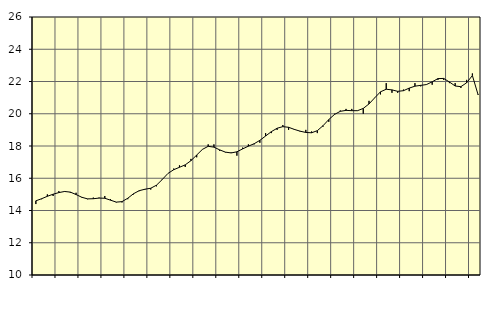
| Category | Piggar | Finansiell verksamhet, företagstjänster, SNI 64-82 |
|---|---|---|
| nan | 14.4 | 14.6 |
| 1.0 | 14.7 | 14.73 |
| 1.0 | 15 | 14.88 |
| 1.0 | 14.9 | 15.01 |
| nan | 15.2 | 15.11 |
| 2.0 | 15.2 | 15.18 |
| 2.0 | 15.1 | 15.14 |
| 2.0 | 15.1 | 14.99 |
| nan | 14.8 | 14.82 |
| 3.0 | 14.7 | 14.72 |
| 3.0 | 14.8 | 14.73 |
| 3.0 | 14.8 | 14.77 |
| nan | 14.9 | 14.76 |
| 4.0 | 14.7 | 14.64 |
| 4.0 | 14.5 | 14.52 |
| 4.0 | 14.5 | 14.55 |
| nan | 14.7 | 14.76 |
| 5.0 | 15 | 15.04 |
| 5.0 | 15.2 | 15.23 |
| 5.0 | 15.3 | 15.32 |
| nan | 15.3 | 15.38 |
| 6.0 | 15.5 | 15.57 |
| 6.0 | 15.9 | 15.92 |
| 6.0 | 16.3 | 16.3 |
| nan | 16.6 | 16.53 |
| 7.0 | 16.8 | 16.68 |
| 7.0 | 16.7 | 16.83 |
| 7.0 | 17.2 | 17.09 |
| nan | 17.3 | 17.44 |
| 8.0 | 17.8 | 17.79 |
| 8.0 | 18.1 | 17.98 |
| 8.0 | 18.1 | 17.93 |
| nan | 17.7 | 17.76 |
| 9.0 | 17.6 | 17.62 |
| 9.0 | 17.6 | 17.57 |
| 9.0 | 17.4 | 17.64 |
| nan | 17.9 | 17.82 |
| 10.0 | 18.1 | 17.99 |
| 10.0 | 18.1 | 18.14 |
| 10.0 | 18.2 | 18.35 |
| nan | 18.8 | 18.62 |
| 11.0 | 18.8 | 18.89 |
| 11.0 | 19 | 19.1 |
| 11.0 | 19.3 | 19.2 |
| nan | 19 | 19.16 |
| 12.0 | 19 | 19.03 |
| 12.0 | 18.9 | 18.92 |
| 12.0 | 19 | 18.84 |
| nan | 18.9 | 18.82 |
| 13.0 | 18.8 | 18.95 |
| 13.0 | 19.2 | 19.26 |
| 13.0 | 19.5 | 19.64 |
| nan | 20 | 19.96 |
| 14.0 | 20.2 | 20.15 |
| 14.0 | 20.3 | 20.21 |
| 14.0 | 20.3 | 20.19 |
| nan | 20.2 | 20.19 |
| 15.0 | 20 | 20.33 |
| 15.0 | 20.8 | 20.61 |
| 15.0 | 21 | 20.99 |
| nan | 21.2 | 21.36 |
| 16.0 | 21.9 | 21.52 |
| 16.0 | 21.3 | 21.48 |
| 16.0 | 21.3 | 21.39 |
| nan | 21.5 | 21.43 |
| 17.0 | 21.4 | 21.59 |
| 17.0 | 21.9 | 21.71 |
| 17.0 | 21.7 | 21.76 |
| nan | 21.8 | 21.81 |
| 18.0 | 21.8 | 21.98 |
| 18.0 | 22.1 | 22.18 |
| 18.0 | 22.1 | 22.19 |
| nan | 21.9 | 21.97 |
| 19.0 | 21.9 | 21.72 |
| 19.0 | 21.6 | 21.68 |
| 19.0 | 22.1 | 21.92 |
| nan | 22.5 | 22.37 |
| 20.0 | 21.2 | 21.17 |